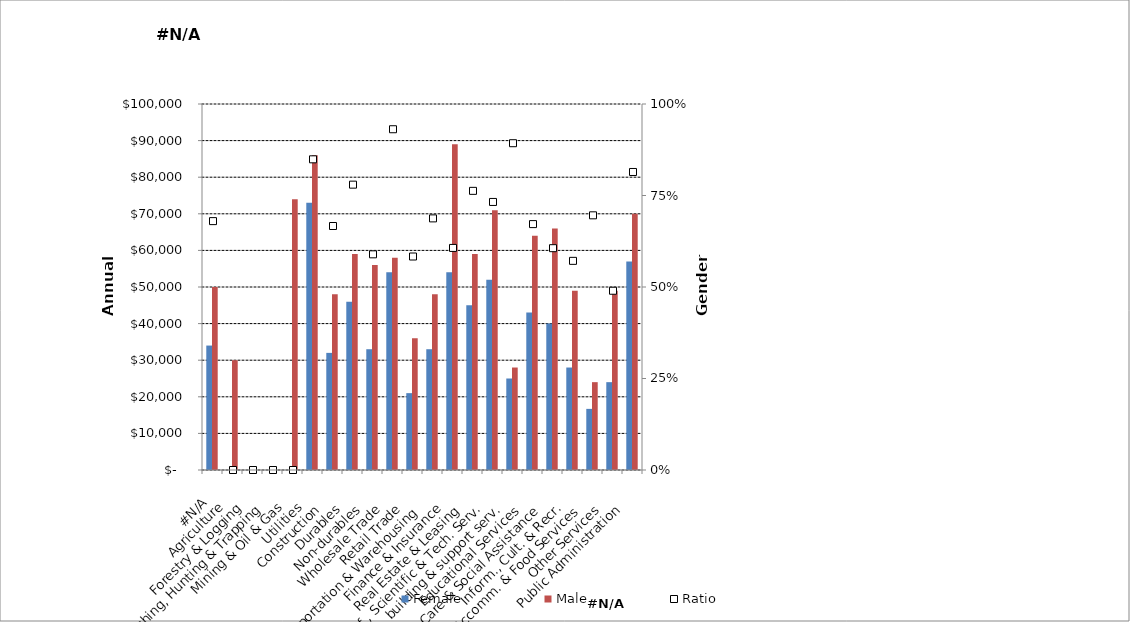
| Category | Female | Male |
|---|---|---|
|  #N/A  | 34000 | 50000 |
|  Agriculture   | 0 | 30000 |
|  Forestry & Logging  | 0 | 0 |
|  Fishing, Hunting & Trapping   | 0 | 0 |
|  Mining & Oil & Gas  | 0 | 74000 |
|  Utilities   | 73000 | 86000 |
|  Construction   | 32000 | 48000 |
|  Durables   | 46000 | 59000 |
|  Non-durables   | 33000 | 56000 |
|  Wholesale Trade   | 54000 | 58000 |
|  Retail Trade   | 21000 | 36000 |
|  Transportation & Warehousing   | 33000 | 48000 |
|  Finance & Insurance   | 54000 | 89000 |
|  Real Estate & Leasing   | 45000 | 59000 |
|  Prof., Scientific & Tech. Serv.  | 52000 | 71000 |
|  Bus., building & support serv.  | 25000 | 28000 |
|  Educational Services   | 43000 | 64000 |
|  Health Care & Social Assistance   | 40000 | 66000 |
|  Inform., Cult. & Recr.  | 28000 | 49000 |
|  Accomm. & Food Services   | 16700 | 24000 |
|  Other Services   | 24000 | 49000 |
|  Public Administration   | 57000 | 70000 |